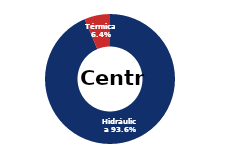
| Category | Centro |
|---|---|
| Eólica | 0 |
| Hidráulica | 2424.232 |
| Solar | 0.006 |
| Térmica | 165.121 |